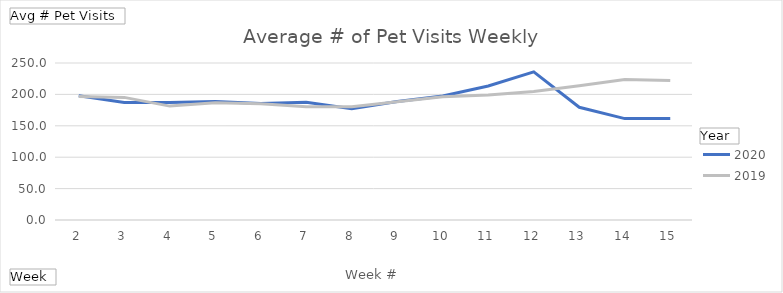
| Category | 2020 | 2019 |
|---|---|---|
| 2 | 197.991 | 196.588 |
| 3 | 187.281 | 195.254 |
| 4 | 187.149 | 181.36 |
| 5 | 188.588 | 186.728 |
| 6 | 185.57 | 185.114 |
| 7 | 187.614 | 180.254 |
| 8 | 177.009 | 180.526 |
| 9 | 188.553 | 188.456 |
| 10 | 197.526 | 196.333 |
| 11 | 213.325 | 199.07 |
| 12 | 235.912 | 204.535 |
| 13 | 179.505 | 213.877 |
| 14 | 161.44 | 223.833 |
| 15 | 161.819 | 221.947 |